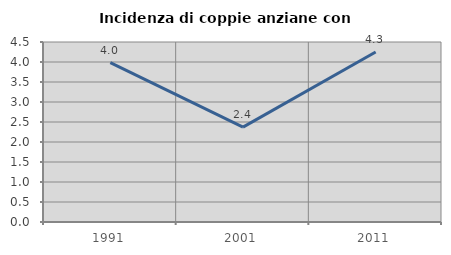
| Category | Incidenza di coppie anziane con figli |
|---|---|
| 1991.0 | 3.985 |
| 2001.0 | 2.372 |
| 2011.0 | 4.251 |